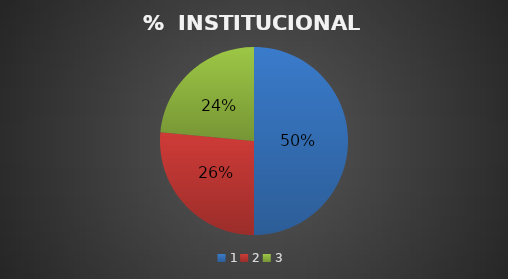
| Category | Series 0 |
|---|---|
| 0 | 17 |
| 1 | 9 |
| 2 | 8 |